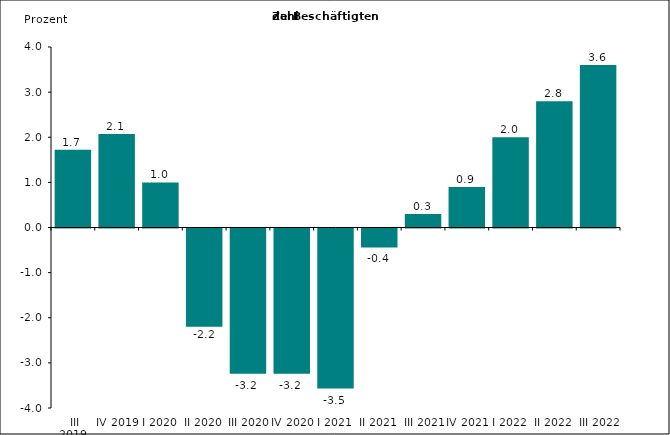
| Category | Series 0 |
|---|---|
|  III 2019 | 1.726 |
| IV 2019 | 2.07 |
| I 2020 | 1 |
| II 2020 | -2.176 |
| III 2020 | -3.218 |
| IV 2020 | -3.22 |
| I 2021 | -3.546 |
| II 2021 | -0.419 |
| III 2021 | 0.3 |
| IV 2021 | 0.9 |
| I 2022 | 2 |
| II 2022 | 2.8 |
| III 2022 | 3.6 |